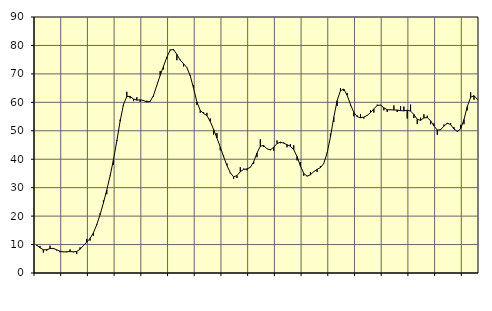
| Category | Piggar | Series 1 |
|---|---|---|
| nan | 9.5 | 9.77 |
| 87.0 | 9.5 | 8.88 |
| 87.0 | 7.2 | 8.17 |
| 87.0 | 7.8 | 8.17 |
| nan | 9.6 | 8.6 |
| 88.0 | 8.4 | 8.66 |
| 88.0 | 7.9 | 8.16 |
| 88.0 | 7.3 | 7.64 |
| nan | 7.5 | 7.4 |
| 89.0 | 7.3 | 7.47 |
| 89.0 | 8.3 | 7.54 |
| 89.0 | 7.3 | 7.45 |
| nan | 6.7 | 7.58 |
| 90.0 | 9 | 8.34 |
| 90.0 | 9.7 | 9.63 |
| 90.0 | 12 | 10.82 |
| nan | 11.4 | 12.14 |
| 91.0 | 13.1 | 14.15 |
| 91.0 | 17.2 | 16.98 |
| 91.0 | 21 | 20.53 |
| nan | 25.5 | 24.63 |
| 92.0 | 27.7 | 29.2 |
| 92.0 | 34.3 | 34.16 |
| 92.0 | 38 | 39.82 |
| nan | 46.7 | 46.35 |
| 93.0 | 53.9 | 53.38 |
| 93.0 | 58.7 | 59.24 |
| 93.0 | 63.7 | 62.02 |
| nan | 61.4 | 62.11 |
| 94.0 | 60.4 | 61.18 |
| 94.0 | 61.8 | 60.77 |
| 94.0 | 60.2 | 60.88 |
| nan | 60.8 | 60.64 |
| 95.0 | 60.6 | 60.13 |
| 95.0 | 60.5 | 60.33 |
| 95.0 | 62 | 62.44 |
| nan | 65.9 | 65.99 |
| 96.0 | 71 | 69.5 |
| 96.0 | 71.6 | 72.68 |
| 96.0 | 75.4 | 75.91 |
| nan | 78.6 | 78.34 |
| 97.0 | 78.3 | 78.59 |
| 97.0 | 74.8 | 76.85 |
| 97.0 | 75 | 74.83 |
| nan | 72.6 | 73.58 |
| 98.0 | 72.3 | 72.22 |
| 98.0 | 69.6 | 69.35 |
| 98.0 | 66 | 64.94 |
| nan | 59.1 | 60.13 |
| 99.0 | 56.3 | 57.14 |
| 99.0 | 56.6 | 56.12 |
| 99.0 | 56.3 | 55.31 |
| nan | 54.3 | 53.27 |
| 0.0 | 48.7 | 50.46 |
| 0.0 | 49.2 | 47.44 |
| 0.0 | 43.1 | 44.29 |
| nan | 41.3 | 40.9 |
| 1.0 | 38.5 | 37.79 |
| 1.0 | 35 | 35.26 |
| 1.0 | 33.1 | 33.81 |
| nan | 33.4 | 34.27 |
| 2.0 | 37.2 | 35.61 |
| 2.0 | 36.7 | 36.43 |
| 2.0 | 36.1 | 36.6 |
| nan | 37.2 | 37.12 |
| 3.0 | 38.4 | 39.1 |
| 3.0 | 40.7 | 42.17 |
| 3.0 | 47 | 44.57 |
| nan | 44.3 | 44.83 |
| 4.0 | 43.7 | 43.65 |
| 4.0 | 43.6 | 43.26 |
| 4.0 | 43 | 44.25 |
| nan | 46.6 | 45.49 |
| 5.0 | 45.6 | 46.01 |
| 5.0 | 45.9 | 45.67 |
| 5.0 | 44.2 | 45.1 |
| nan | 45.3 | 44.55 |
| 6.0 | 44.9 | 43.35 |
| 6.0 | 39.6 | 40.95 |
| 6.0 | 39 | 37.66 |
| nan | 34.2 | 35.03 |
| 7.0 | 34.2 | 34.03 |
| 7.0 | 35.4 | 34.53 |
| 7.0 | 35.5 | 35.61 |
| nan | 35.5 | 36.44 |
| 8.0 | 37.6 | 37.04 |
| 8.0 | 38.6 | 38.52 |
| 8.0 | 42.3 | 42.19 |
| nan | 49 | 47.79 |
| 9.0 | 53.1 | 54.73 |
| 9.0 | 58.7 | 60.56 |
| 9.0 | 65 | 64.09 |
| nan | 64 | 64.67 |
| 10.0 | 63.3 | 62.5 |
| 10.0 | 58.9 | 59.26 |
| 10.0 | 55.1 | 56.45 |
| nan | 55.4 | 54.96 |
| 11.0 | 55.9 | 54.59 |
| 11.0 | 54.3 | 54.8 |
| 11.0 | 55.3 | 55.41 |
| nan | 57.3 | 56.36 |
| 12.0 | 56.4 | 57.69 |
| 12.0 | 59.2 | 58.89 |
| 12.0 | 59.1 | 59.02 |
| nan | 57.2 | 58.09 |
| 13.0 | 56.6 | 57.4 |
| 13.0 | 57.5 | 57.37 |
| 13.0 | 58.9 | 57.3 |
| nan | 56.6 | 57.28 |
| 14.0 | 58.7 | 57.09 |
| 14.0 | 58.5 | 57 |
| 14.0 | 54.3 | 57.23 |
| nan | 59.2 | 56.94 |
| 15.0 | 54.5 | 55.72 |
| 15.0 | 52.4 | 54.02 |
| 15.0 | 54.6 | 53.66 |
| nan | 55.8 | 54.54 |
| 16.0 | 55.3 | 54.64 |
| 16.0 | 52.3 | 53.53 |
| 16.0 | 52.6 | 51.68 |
| nan | 48.6 | 50.25 |
| 17.0 | 50.6 | 50.37 |
| 17.0 | 52.2 | 51.64 |
| 17.0 | 52.4 | 52.66 |
| nan | 52.7 | 52.17 |
| 18.0 | 51.3 | 50.63 |
| 18.0 | 49.6 | 49.76 |
| 18.0 | 52.1 | 50.63 |
| nan | 52.3 | 53.97 |
| 19.0 | 57.2 | 58.55 |
| 19.0 | 63.5 | 61.76 |
| 19.0 | 60.9 | 62.34 |
| nan | 60.9 | 61.11 |